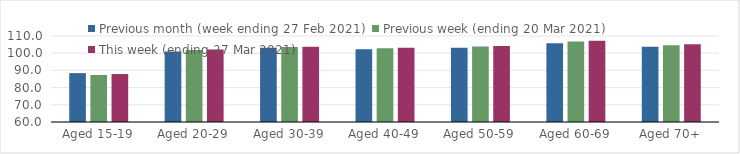
| Category | Previous month (week ending 27 Feb 2021) | Previous week (ending 20 Mar 2021) | This week (ending 27 Mar 2021) |
|---|---|---|---|
| Aged 15-19 | 88.42 | 87.34 | 87.88 |
| Aged 20-29 | 101.01 | 101.91 | 102.08 |
| Aged 30-39 | 103.23 | 103.58 | 103.8 |
| Aged 40-49 | 102.33 | 102.82 | 103.18 |
| Aged 50-59 | 103.1 | 103.83 | 104.14 |
| Aged 60-69 | 105.79 | 106.86 | 107.19 |
| Aged 70+ | 103.73 | 104.66 | 105.19 |